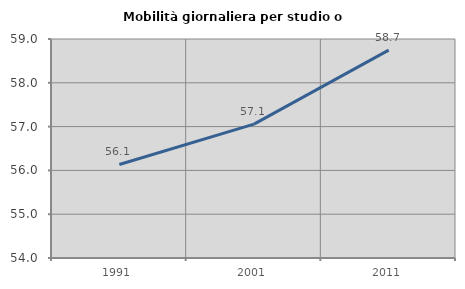
| Category | Mobilità giornaliera per studio o lavoro |
|---|---|
| 1991.0 | 56.136 |
| 2001.0 | 57.057 |
| 2011.0 | 58.746 |